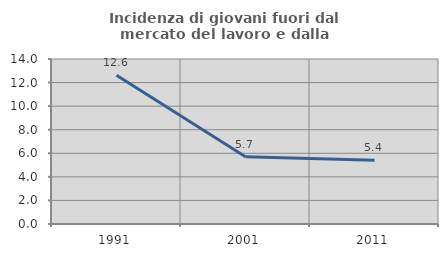
| Category | Incidenza di giovani fuori dal mercato del lavoro e dalla formazione  |
|---|---|
| 1991.0 | 12.625 |
| 2001.0 | 5.707 |
| 2011.0 | 5.414 |